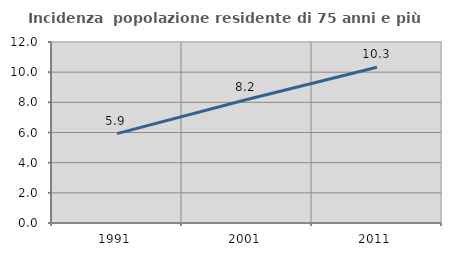
| Category | Incidenza  popolazione residente di 75 anni e più |
|---|---|
| 1991.0 | 5.927 |
| 2001.0 | 8.186 |
| 2011.0 | 10.321 |